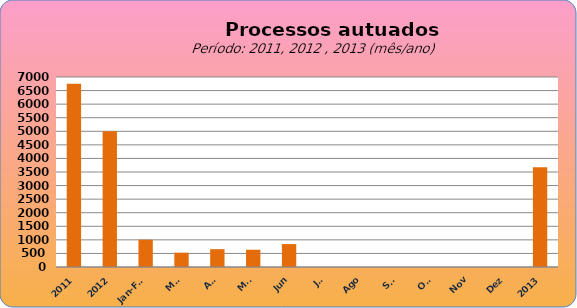
| Category | 6749 4998 1006 527 657 636 845 0 0 0 0 0 0 |
|---|---|
| 2011 | 6749 |
| 2012 | 4998 |
| Jan-Fev | 1006 |
| Mar | 527 |
| Abr | 657 |
| Mai | 636 |
| Jun | 845 |
| Jul | 0 |
| Ago | 0 |
| Set | 0 |
| Out | 0 |
| Nov | 0 |
| Dez | 0 |
| 2013 | 3671 |